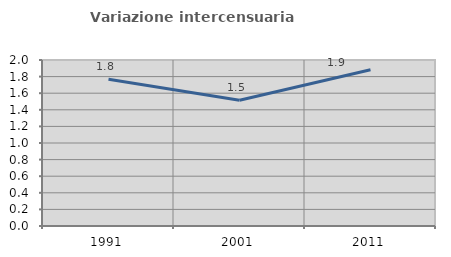
| Category | Variazione intercensuaria annua |
|---|---|
| 1991.0 | 1.769 |
| 2001.0 | 1.515 |
| 2011.0 | 1.883 |